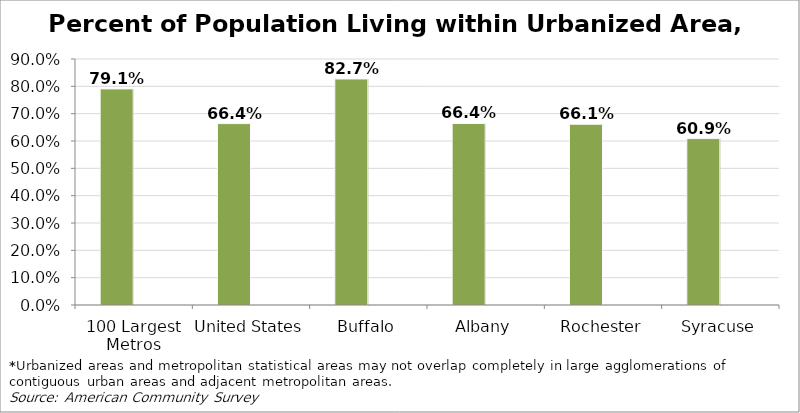
| Category | Percent of Population Living within Urbanized Area* | Series 1 |
|---|---|---|
| 100 Largest Metros | 0.791 |  |
| United States | 0.664 |  |
| Buffalo | 0.827 |  |
| Albany | 0.664 |  |
| Rochester | 0.661 |  |
| Syracuse | 0.609 |  |